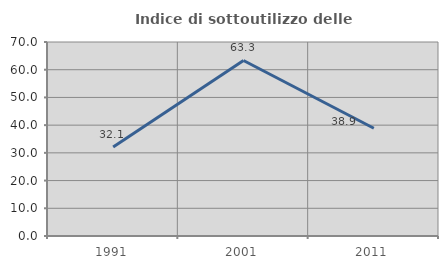
| Category | Indice di sottoutilizzo delle abitazioni  |
|---|---|
| 1991.0 | 32.143 |
| 2001.0 | 63.333 |
| 2011.0 | 38.889 |